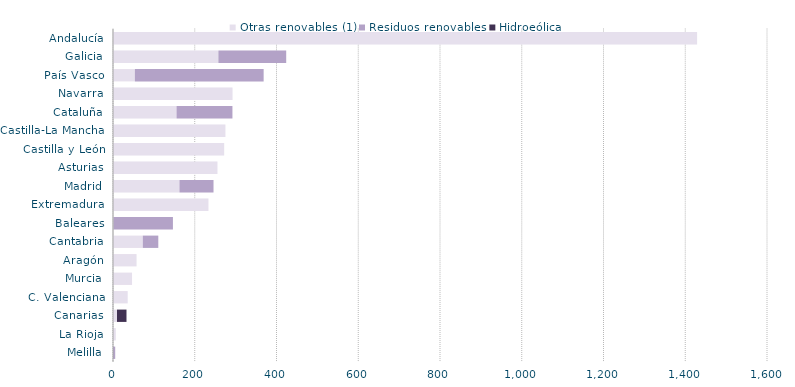
| Category | Otras renovables (1) | Residuos renovables | Hidroeólica |
|---|---|---|---|
| Melilla | 0 | 5.397 | 0 |
| La Rioja | 6.812 | 0 | 0 |
| Canarias | 9.774 | 0 | 23.249 |
| C. Valenciana | 35.939 | 0 | 0 |
| Murcia | 46.567 | 0 | 0 |
| Aragón | 57.642 | 0 | 0 |
| Cantabria | 72.91 | 37.916 | 0 |
| Baleares | 1.139 | 145.463 | 0 |
| Extremadura | 233.488 | 0 | 0 |
| Madrid | 162.572 | 83.304 | 0 |
| Asturias | 255.521 | 0 | 0 |
| Castilla y León | 271.952 | 0 | 0 |
| Castilla-La Mancha | 275.068 | 0 | 0 |
| Cataluña | 155.408 | 136.778 | 0 |
| Navarra | 292.374 | 0 | 0 |
| País Vasco | 53.514 | 315.032 | 0 |
| Galicia | 257.816 | 165.924 | 0 |
| Andalucía | 1428.997 | 0 | 0 |